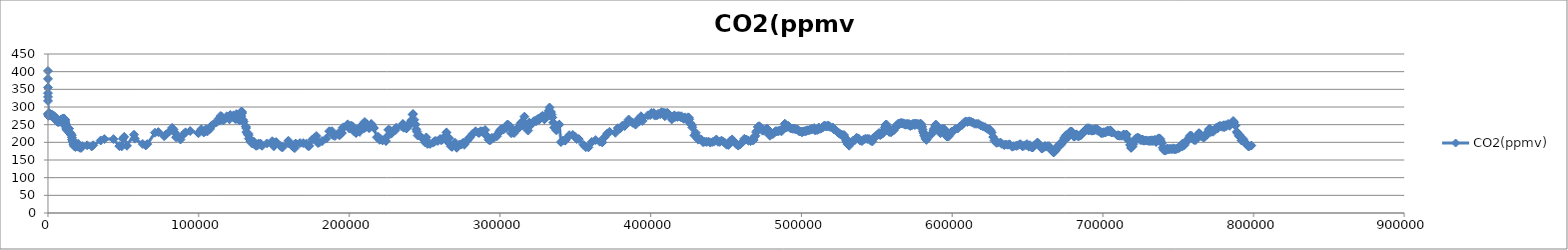
| Category | CO2(ppmv) |
|---|---|
| 0.0 | 401.9 |
| 10.0 | 379.6 |
| 25.0 | 355.1 |
| 35.0 | 339.3 |
| 43.0 | 328.6 |
| 56.0 | 317.3 |
| 137.0 | 280.4 |
| 268.0 | 274.9 |
| 279.0 | 277.9 |
| 395.0 | 279.1 |
| 404.0 | 281.9 |
| 485.0 | 277.7 |
| 559.0 | 281.1 |
| 672.0 | 282.2 |
| 754.0 | 280.1 |
| 877.0 | 278.4 |
| 950.0 | 276.6 |
| 1060.0 | 279.1 |
| 1153.0 | 277.7 |
| 1233.0 | 278.7 |
| 1350.0 | 277.4 |
| 1453.0 | 279.2 |
| 1552.0 | 280 |
| 1638.0 | 278.9 |
| 1733.0 | 278.7 |
| 1812.0 | 278 |
| 1931.0 | 276.9 |
| 2057.0 | 276.7 |
| 2128.0 | 276.7 |
| 2212.0 | 277.6 |
| 2334.0 | 277.9 |
| 2433.0 | 273.9 |
| 2536.0 | 278.9 |
| 2604.0 | 275.3 |
| 2728.0 | 274.7 |
| 2806.0 | 276.3 |
| 2902.0 | 274.6 |
| 3053.0 | 276.3 |
| 3116.0 | 273.1 |
| 3215.0 | 274 |
| 3336.0 | 275 |
| 3453.0 | 273.4 |
| 3523.0 | 273 |
| 3622.0 | 271.5 |
| 3721.0 | 275.4 |
| 3790.0 | 274.9 |
| 3910.0 | 271.7 |
| 4004.0 | 271.6 |
| 4096.0 | 272.8 |
| 4161.0 | 271.5 |
| 4324.0 | 271.1 |
| 4374.0 | 269.1 |
| 4480.0 | 269.8 |
| 4573.0 | 271.5 |
| 4703.0 | 270.7 |
| 4766.0 | 269.3 |
| 4874.0 | 268.6 |
| 5004.0 | 269.8 |
| 5094.0 | 267.6 |
| 5160.0 | 265.3 |
| 5274.0 | 265.2 |
| 5370.0 | 267.6 |
| 5476.0 | 265.9 |
| 5562.0 | 265.5 |
| 5657.0 | 260.7 |
| 5716.0 | 266.7 |
| 5855.0 | 265.5 |
| 5998.0 | 263.2 |
| 6039.0 | 262.7 |
| 6131.0 | 261.2 |
| 6263.0 | 261.1 |
| 6354.0 | 259.4 |
| 6434.0 | 262.1 |
| 6545.0 | 262.9 |
| 6617.0 | 258.1 |
| 6713.0 | 257.6 |
| 6838.0 | 262.3 |
| 6941.0 | 263 |
| 7028.0 | 260.7 |
| 7112.0 | 258.4 |
| 7234.0 | 260.1 |
| 7320.0 | 260.4 |
| 7413.0 | 259.7 |
| 7507.0 | 259.2 |
| 7590.0 | 260.8 |
| 7691.0 | 259.6 |
| 7781.0 | 259.3 |
| 7876.0 | 258.3 |
| 7990.0 | 261.3 |
| 8050.0 | 260.7 |
| 8181.0 | 261.8 |
| 8281.0 | 259 |
| 8387.0 | 260.9 |
| 8477.0 | 260.4 |
| 8579.0 | 259.3 |
| 8653.0 | 262 |
| 8784.0 | 263.7 |
| 8869.0 | 263.8 |
| 8973.0 | 265.2 |
| 9092.0 | 260.6 |
| 9140.0 | 260.9 |
| 9232.0 | 263 |
| 9317.0 | 263.8 |
| 9536.0 | 264.4 |
| 9597.0 | 264.2 |
| 9721.0 | 264 |
| 9807.0 | 263.4 |
| 9909.0 | 265.7 |
| 9983.0 | 264.9 |
| 10088.0 | 267.5 |
| 10209.0 | 266.9 |
| 10294.0 | 266 |
| 10417.0 | 265.1 |
| 10527.0 | 267.6 |
| 10621.0 | 264.8 |
| 10744.0 | 264.8 |
| 10805.0 | 265 |
| 10827.0 | 265.3 |
| 10895.0 | 264.4 |
| 10933.0 | 264.1 |
| 11014.0 | 264.2 |
| 11087.0 | 264.5 |
| 11136.0 | 264 |
| 11201.0 | 263 |
| 11236.0 | 265.2 |
| 11278.0 | 258.8 |
| 11338.0 | 260.8 |
| 11392.0 | 255.4 |
| 11436.0 | 253.9 |
| 11469.0 | 253.8 |
| 11580.0 | 250.7 |
| 11635.0 | 249.7 |
| 11676.0 | 251.1 |
| 11727.0 | 250.7 |
| 11819.0 | 245.3 |
| 11896.0 | 245.3 |
| 11958.0 | 246.6 |
| 12050.0 | 243.2 |
| 12122.0 | 240.3 |
| 12371.0 | 237.5 |
| 12496.0 | 237.6 |
| 12642.0 | 234.2 |
| 12760.0 | 238.3 |
| 12942.0 | 237.3 |
| 13090.0 | 237.9 |
| 13241.0 | 237.6 |
| 13440.0 | 236.4 |
| 13542.0 | 239.2 |
| 13653.0 | 238.6 |
| 13804.0 | 238.6 |
| 13948.0 | 239.1 |
| 14303.0 | 228.5 |
| 14550.0 | 228.4 |
| 14725.0 | 226.1 |
| 14890.0 | 225.2 |
| 15012.0 | 224.5 |
| 15233.0 | 222 |
| 15438.0 | 221 |
| 15570.0 | 220.9 |
| 15742.0 | 219.4 |
| 15886.0 | 214 |
| 16073.0 | 207.5 |
| 16260.0 | 207.7 |
| 16452.0 | 202.9 |
| 16659.0 | 200.8 |
| 16870.0 | 195.2 |
| 17111.0 | 193.9 |
| 17375.0 | 191 |
| 17565.0 | 188.5 |
| 17809.0 | 188.5 |
| 17943.0 | 189.2 |
| 18285.0 | 187 |
| 18541.0 | 188.6 |
| 18828.0 | 189.4 |
| 18868.0 | 192.3 |
| 18921.0 | 188.3 |
| 19347.0 | 188.7 |
| 19509.0 | 188.8 |
| 19748.0 | 190 |
| 19988.0 | 188 |
| 20168.0 | 188.2 |
| 20197.0 | 195 |
| 20502.0 | 187.8 |
| 20748.0 | 186.9 |
| 21011.0 | 186.5 |
| 21257.0 | 184.7 |
| 21507.0 | 186.1 |
| 21854.0 | 185.7 |
| 22015.0 | 184.4 |
| 22827.0 | 189.2 |
| 25994.0 | 191.6 |
| 29063.0 | 188.5 |
| 30020.0 | 191.7 |
| 35009.0 | 205.3 |
| 37471.0 | 209.1 |
| 43500.0 | 209.1 |
| 47336.0 | 189.3 |
| 48854.0 | 188.4 |
| 49690.0 | 210.1 |
| 50663.0 | 215.7 |
| 52382.0 | 190.4 |
| 57088.0 | 221.7 |
| 57657.0 | 210.4 |
| 62859.0 | 195.3 |
| 64939.0 | 191.4 |
| 65939.0 | 194.9 |
| 71049.0 | 227.3 |
| 73227.0 | 229.1 |
| 77150.0 | 217.1 |
| 78183.0 | 221.7 |
| 80614.0 | 230.9 |
| 82417.0 | 241.1 |
| 83333.0 | 236.4 |
| 84016.0 | 228 |
| 85020.0 | 214.2 |
| 86181.0 | 217 |
| 87917.0 | 208 |
| 90357.0 | 224.2 |
| 91249.0 | 228.3 |
| 94353.0 | 232 |
| 99849.0 | 225.8 |
| 100837.0 | 230.8 |
| 101749.0 | 236.9 |
| 103465.0 | 228.1 |
| 104704.0 | 236.9 |
| 105636.0 | 230.6 |
| 107579.0 | 238.2 |
| 108153.0 | 245.6 |
| 109804.0 | 251.2 |
| 111862.0 | 256.7 |
| 113262.0 | 266.3 |
| 114096.0 | 261.4 |
| 114601.0 | 274.5 |
| 115118.0 | 273.2 |
| 116501.0 | 262.5 |
| 117750.0 | 267.6 |
| 118649.0 | 273.7 |
| 119672.0 | 271.9 |
| 120382.0 | 265.2 |
| 121017.0 | 277.6 |
| 122344.0 | 272.1 |
| 123070.0 | 276.4 |
| 124213.0 | 268.7 |
| 124257.0 | 266.6 |
| 124789.0 | 266.3 |
| 125081.0 | 279.7 |
| 125262.0 | 273 |
| 125434.0 | 277.1 |
| 126347.0 | 273.7 |
| 126598.0 | 267.1 |
| 126886.0 | 262.5 |
| 127132.0 | 262.6 |
| 127622.0 | 275.3 |
| 127907.0 | 275.6 |
| 128344.0 | 274 |
| 128372.0 | 287.1 |
| 128609.0 | 286.8 |
| 128866.0 | 282.6 |
| 129146.0 | 264.1 |
| 129340.0 | 263.4 |
| 129652.0 | 257.9 |
| 129736.0 | 259 |
| 131329.0 | 245 |
| 131455.0 | 240.4 |
| 131728.0 | 228.9 |
| 132492.0 | 223.5 |
| 133069.0 | 223.9 |
| 133105.0 | 220.3 |
| 133427.0 | 210.6 |
| 134123.0 | 208.9 |
| 134287.0 | 203.7 |
| 134960.0 | 204.5 |
| 135114.0 | 200.4 |
| 135207.0 | 198 |
| 135603.0 | 198 |
| 135883.0 | 201.7 |
| 136011.0 | 200.7 |
| 136251.0 | 202.4 |
| 136567.0 | 195.8 |
| 136655.0 | 201.1 |
| 137293.0 | 194.3 |
| 137633.0 | 193.4 |
| 137982.0 | 194.2 |
| 138185.0 | 190.2 |
| 139275.0 | 192.3 |
| 139617.0 | 196.5 |
| 140899.0 | 195.6 |
| 140960.0 | 196.4 |
| 142058.0 | 190.4 |
| 145363.0 | 196.9 |
| 148831.0 | 203 |
| 149803.0 | 191.9 |
| 149921.0 | 188.9 |
| 151423.0 | 200.6 |
| 154480.0 | 189 |
| 155395.0 | 185.5 |
| 155813.0 | 187.5 |
| 159562.0 | 204.3 |
| 159943.0 | 196.5 |
| 161679.0 | 191.6 |
| 162228.0 | 190.1 |
| 163024.0 | 186.7 |
| 163698.0 | 183.8 |
| 164439.0 | 196.6 |
| 167183.0 | 197.8 |
| 169492.0 | 197.7 |
| 171351.0 | 196 |
| 172434.0 | 190.3 |
| 173135.0 | 189.4 |
| 173394.0 | 190.1 |
| 175306.0 | 207.7 |
| 177139.0 | 213.2 |
| 178179.0 | 217.7 |
| 179117.0 | 198.1 |
| 180068.0 | 199.7 |
| 182046.0 | 203.4 |
| 184685.0 | 210.7 |
| 186697.0 | 231.3 |
| 188436.0 | 231.4 |
| 189076.0 | 220.3 |
| 190352.0 | 218 |
| 192910.0 | 226.5 |
| 193481.0 | 220 |
| 195017.0 | 226.4 |
| 195673.0 | 241.2 |
| 196179.0 | 242.6 |
| 198972.0 | 250.9 |
| 199918.0 | 239.1 |
| 201163.0 | 247.6 |
| 202413.0 | 244.4 |
| 202874.0 | 231.9 |
| 203317.0 | 232.2 |
| 203837.0 | 228.6 |
| 204480.0 | 226.3 |
| 204908.0 | 229.4 |
| 205362.0 | 231.4 |
| 205952.0 | 238.1 |
| 206144.0 | 237.2 |
| 206810.0 | 230 |
| 207120.0 | 240.5 |
| 207544.0 | 242.2 |
| 208064.0 | 244.6 |
| 208254.0 | 243.9 |
| 208803.0 | 247.2 |
| 208995.0 | 252 |
| 209432.0 | 246.9 |
| 209817.0 | 239.5 |
| 210154.0 | 257.4 |
| 210813.0 | 243.4 |
| 211858.0 | 251.2 |
| 212716.0 | 241.4 |
| 213270.0 | 240.3 |
| 213536.0 | 242.6 |
| 213984.0 | 247.5 |
| 214459.0 | 251.7 |
| 214794.0 | 251.1 |
| 215382.0 | 245.3 |
| 216352.0 | 240.5 |
| 218361.0 | 214.1 |
| 219116.0 | 216.1 |
| 220058.0 | 207.1 |
| 220739.0 | 208.8 |
| 222030.0 | 205.6 |
| 224269.0 | 203.3 |
| 224923.0 | 215.7 |
| 225909.0 | 235.5 |
| 226711.0 | 234.5 |
| 227027.0 | 233.1 |
| 227776.0 | 224.5 |
| 229423.0 | 232.4 |
| 230422.0 | 233.9 |
| 231066.0 | 241.6 |
| 234817.0 | 245.2 |
| 235480.0 | 252.1 |
| 236114.0 | 241.4 |
| 236734.0 | 247.4 |
| 237294.0 | 243.1 |
| 237868.0 | 239.1 |
| 238558.0 | 245.6 |
| 239013.0 | 245.8 |
| 239477.0 | 247.4 |
| 239973.0 | 252.8 |
| 240945.0 | 259.7 |
| 241366.0 | 263.2 |
| 242007.0 | 279 |
| 242346.0 | 280.2 |
| 243071.0 | 263.7 |
| 243429.0 | 252.3 |
| 243856.0 | 249.9 |
| 244347.0 | 236.7 |
| 244864.0 | 230.4 |
| 245441.0 | 219.4 |
| 247681.0 | 214.7 |
| 250133.0 | 200.2 |
| 251005.0 | 213.9 |
| 251864.0 | 195.4 |
| 252739.0 | 196.7 |
| 253636.0 | 195.4 |
| 255498.0 | 199 |
| 256309.0 | 201.9 |
| 257100.0 | 204 |
| 258661.0 | 203.9 |
| 260353.0 | 209.6 |
| 260916.0 | 205.7 |
| 262092.0 | 208.9 |
| 262930.0 | 214.6 |
| 264509.0 | 228.1 |
| 265653.0 | 199.9 |
| 266326.0 | 211.7 |
| 267442.0 | 188.7 |
| 268181.0 | 187.2 |
| 269154.0 | 194.2 |
| 270222.0 | 198.8 |
| 271256.0 | 184.7 |
| 272311.0 | 190.4 |
| 273310.0 | 193.9 |
| 274321.0 | 194.1 |
| 275350.0 | 198.4 |
| 276326.0 | 193.2 |
| 277361.0 | 202.2 |
| 278350.0 | 204.5 |
| 279320.0 | 211 |
| 280269.0 | 215.3 |
| 281758.0 | 223.7 |
| 283785.0 | 231.3 |
| 285380.0 | 228 |
| 286128.0 | 226.4 |
| 287036.0 | 231.4 |
| 287538.0 | 230.4 |
| 288233.0 | 231 |
| 290153.0 | 234.9 |
| 290730.0 | 220.4 |
| 291367.0 | 217.1 |
| 292405.0 | 207.6 |
| 293057.0 | 206 |
| 293779.0 | 206.7 |
| 294568.0 | 212.7 |
| 295930.0 | 213.1 |
| 297921.0 | 217.1 |
| 298741.0 | 224.4 |
| 299621.0 | 231 |
| 300472.0 | 236.1 |
| 301402.0 | 239 |
| 302280.0 | 236 |
| 303226.0 | 240.2 |
| 304232.0 | 240.7 |
| 304901.0 | 250.2 |
| 305655.0 | 248.6 |
| 306547.0 | 244.8 |
| 307495.0 | 225.8 |
| 308744.0 | 227.8 |
| 309389.0 | 226.2 |
| 310168.0 | 233.2 |
| 311013.0 | 237.8 |
| 311868.0 | 239 |
| 312676.0 | 241.9 |
| 313414.0 | 251.6 |
| 314144.0 | 256.7 |
| 314867.0 | 257.1 |
| 315572.0 | 246.8 |
| 316200.0 | 272.6 |
| 316897.0 | 251.6 |
| 317734.0 | 245.2 |
| 318559.0 | 233.4 |
| 319480.0 | 255.8 |
| 320358.0 | 249.2 |
| 322015.0 | 257.2 |
| 322767.0 | 260.4 |
| 323526.0 | 260.3 |
| 324280.0 | 260.5 |
| 324971.0 | 266.2 |
| 325720.0 | 264 |
| 326321.0 | 266.1 |
| 326972.0 | 270.1 |
| 327590.0 | 271.9 |
| 328221.0 | 275.1 |
| 329475.0 | 265 |
| 330208.0 | 271.7 |
| 330740.0 | 272.6 |
| 331438.0 | 273.1 |
| 331944.0 | 282.4 |
| 332285.0 | 289.1 |
| 332462.0 | 288.4 |
| 332919.0 | 298.6 |
| 333380.0 | 278.1 |
| 333890.0 | 285.8 |
| 334261.0 | 278.6 |
| 334748.0 | 270.5 |
| 335287.0 | 255.7 |
| 335918.0 | 241.9 |
| 336725.0 | 239.6 |
| 337391.0 | 234.2 |
| 339298.0 | 250.1 |
| 340456.0 | 200.7 |
| 341802.0 | 205.2 |
| 343282.0 | 204.8 |
| 344446.0 | 211.9 |
| 345980.0 | 220.3 |
| 348298.0 | 221.1 |
| 349688.0 | 216.2 |
| 350925.0 | 209.4 |
| 352275.0 | 209.2 |
| 355302.0 | 193 |
| 356898.0 | 186.1 |
| 358712.0 | 185.8 |
| 360957.0 | 201.2 |
| 363385.0 | 206.3 |
| 366235.0 | 201.9 |
| 367856.0 | 199.9 |
| 369446.0 | 214.7 |
| 371090.0 | 224.6 |
| 372646.0 | 229.6 |
| 376568.0 | 227 |
| 378096.0 | 240 |
| 379696.0 | 239.1 |
| 381132.0 | 246.8 |
| 382670.0 | 245.8 |
| 384534.0 | 258.1 |
| 385398.0 | 264.6 |
| 386144.0 | 259.2 |
| 388062.0 | 255.2 |
| 389946.0 | 250.1 |
| 391896.0 | 266.3 |
| 392544.0 | 259.5 |
| 393579.0 | 273.6 |
| 394560.0 | 260.7 |
| 398086.0 | 276.3 |
| 399722.0 | 277.1 |
| 400504.0 | 283.2 |
| 402000.0 | 283.1 |
| 402731.0 | 275.7 |
| 404181.0 | 276.5 |
| 404927.0 | 280.5 |
| 406368.0 | 279.6 |
| 407093.0 | 285.6 |
| 408600.0 | 284.5 |
| 409383.0 | 275.2 |
| 409383.0 | 274.2 |
| 410206.0 | 282.6 |
| 411071.0 | 283.5 |
| 412962.0 | 274.9 |
| 413948.0 | 264.9 |
| 414963.0 | 271.6 |
| 415717.0 | 276.4 |
| 416193.0 | 271.7 |
| 417191.0 | 273.4 |
| 417698.0 | 271.8 |
| 418245.0 | 274.6 |
| 419260.0 | 273.7 |
| 419808.0 | 271.2 |
| 420350.0 | 273.8 |
| 421484.0 | 268.6 |
| 422074.0 | 266.4 |
| 422649.0 | 270.6 |
| 423764.0 | 267.7 |
| 424332.0 | 268.3 |
| 424840.0 | 270.8 |
| 425242.0 | 270 |
| 425569.0 | 265.4 |
| 425975.0 | 255.3 |
| 426598.0 | 252.1 |
| 427285.0 | 248.2 |
| 427566.0 | 242.5 |
| 429006.0 | 219.7 |
| 429876.0 | 227.2 |
| 431063.0 | 211.5 |
| 431445.0 | 207.6 |
| 432599.0 | 209.8 |
| 433674.0 | 207.5 |
| 434804.0 | 200.3 |
| 435989.0 | 201.7 |
| 437152.0 | 201.3 |
| 438356.0 | 202 |
| 439565.0 | 199.1 |
| 441220.0 | 201.1 |
| 442411.0 | 203.5 |
| 443562.0 | 208.1 |
| 444650.0 | 201.7 |
| 445829.0 | 201.2 |
| 446984.0 | 204.9 |
| 448103.0 | 201.9 |
| 449244.0 | 198.4 |
| 450455.0 | 193.3 |
| 451593.0 | 192.5 |
| 452283.0 | 199.1 |
| 452795.0 | 204.3 |
| 453514.0 | 203.3 |
| 454023.0 | 208.3 |
| 455279.0 | 202.4 |
| 456591.0 | 195.5 |
| 458049.0 | 190.7 |
| 459430.0 | 194.4 |
| 460792.0 | 199.9 |
| 461687.0 | 205.2 |
| 462133.0 | 210 |
| 463456.0 | 208.1 |
| 464866.0 | 204.4 |
| 466265.0 | 203.4 |
| 467602.0 | 205.5 |
| 468323.0 | 206.5 |
| 468810.0 | 215.5 |
| 469470.0 | 218.7 |
| 469941.0 | 229.2 |
| 470597.0 | 232.7 |
| 471046.0 | 243.7 |
| 471763.0 | 243.9 |
| 472095.0 | 245.6 |
| 473102.0 | 241.2 |
| 474162.0 | 233.1 |
| 475218.0 | 232.8 |
| 476240.0 | 236.6 |
| 477162.0 | 239.1 |
| 477719.0 | 236.5 |
| 478124.0 | 231.3 |
| 478721.0 | 220.8 |
| 479144.0 | 218.8 |
| 480108.0 | 223.8 |
| 481035.0 | 223.4 |
| 481932.0 | 227.3 |
| 482803.0 | 231.4 |
| 483649.0 | 231.4 |
| 484465.0 | 231.2 |
| 485276.0 | 233 |
| 486043.0 | 232.9 |
| 486816.0 | 231.3 |
| 487541.0 | 237.1 |
| 488268.0 | 242 |
| 488689.0 | 240.9 |
| 488996.0 | 252.8 |
| 489475.0 | 249.3 |
| 489722.0 | 242.6 |
| 490445.0 | 243.3 |
| 491191.0 | 246.7 |
| 491959.0 | 243.7 |
| 492738.0 | 239.7 |
| 493507.0 | 239.1 |
| 494311.0 | 238.3 |
| 495085.0 | 238.5 |
| 495853.0 | 237.6 |
| 496608.0 | 236.4 |
| 497366.0 | 236.5 |
| 498104.0 | 232.8 |
| 498865.0 | 230.6 |
| 499610.0 | 230.8 |
| 500363.0 | 228.2 |
| 501130.0 | 230.8 |
| 501866.0 | 231.2 |
| 502625.0 | 232 |
| 503375.0 | 232.2 |
| 504083.0 | 234.1 |
| 504777.0 | 233.9 |
| 505516.0 | 235.5 |
| 506287.0 | 236 |
| 507011.0 | 238.2 |
| 507714.0 | 237 |
| 508476.0 | 240.3 |
| 509247.0 | 233.4 |
| 510008.0 | 236.4 |
| 510765.0 | 235.2 |
| 511515.0 | 242 |
| 512269.0 | 238.2 |
| 512997.0 | 239.2 |
| 513724.0 | 241.5 |
| 514429.0 | 243 |
| 515113.0 | 247.2 |
| 515771.0 | 246.2 |
| 516417.0 | 245.5 |
| 517069.0 | 245.3 |
| 517706.0 | 247.7 |
| 518334.0 | 245.5 |
| 518965.0 | 243.5 |
| 520892.0 | 241.9 |
| 521552.0 | 236.8 |
| 522216.0 | 235.8 |
| 522923.0 | 233.7 |
| 523666.0 | 230.3 |
| 524409.0 | 227.8 |
| 525164.0 | 224.7 |
| 525908.0 | 222.7 |
| 526661.0 | 221.2 |
| 527454.0 | 220.3 |
| 528262.0 | 220.7 |
| 528747.0 | 214.5 |
| 529101.0 | 211.4 |
| 529640.0 | 204.4 |
| 530016.0 | 200 |
| 530685.0 | 195.1 |
| 531035.0 | 193.8 |
| 531662.0 | 190.5 |
| 532119.0 | 199.8 |
| 533246.0 | 199.4 |
| 534364.0 | 205 |
| 535483.0 | 206.4 |
| 536622.0 | 212.9 |
| 537770.0 | 211.2 |
| 538959.0 | 205 |
| 540154.0 | 203.6 |
| 541345.0 | 208.1 |
| 542502.0 | 210.3 |
| 543676.0 | 209.6 |
| 544804.0 | 209.7 |
| 545956.0 | 204.6 |
| 547013.0 | 202.5 |
| 547573.0 | 208.8 |
| 547972.0 | 213.6 |
| 548933.0 | 215.2 |
| 549830.0 | 219.9 |
| 550637.0 | 221.7 |
| 551124.0 | 222.3 |
| 551452.0 | 226.3 |
| 551979.0 | 222.1 |
| 552250.0 | 220.3 |
| 552961.0 | 223.6 |
| 553626.0 | 224.3 |
| 554254.0 | 226.7 |
| 554831.0 | 233.9 |
| 555345.0 | 241 |
| 555637.0 | 243 |
| 555839.0 | 249.1 |
| 556143.0 | 244 |
| 556364.0 | 250.5 |
| 556724.0 | 245.6 |
| 556889.0 | 240.4 |
| 557385.0 | 238.1 |
| 557887.0 | 234.5 |
| 558183.0 | 229.7 |
| 558393.0 | 230.2 |
| 558929.0 | 230.3 |
| 559461.0 | 228.3 |
| 559972.0 | 231.6 |
| 560459.0 | 231.9 |
| 560930.0 | 234.6 |
| 561309.0 | 234.1 |
| 561846.0 | 240.1 |
| 562272.0 | 242.3 |
| 562690.0 | 245.7 |
| 563115.0 | 245.8 |
| 563517.0 | 247.6 |
| 563918.0 | 251.4 |
| 564311.0 | 252.4 |
| 564699.0 | 252.6 |
| 565077.0 | 251.4 |
| 565466.0 | 253.7 |
| 565851.0 | 254.3 |
| 566233.0 | 253.9 |
| 566619.0 | 254.5 |
| 567007.0 | 253.2 |
| 567381.0 | 253.9 |
| 567777.0 | 252.8 |
| 568167.0 | 253 |
| 568556.0 | 250.2 |
| 568946.0 | 251.3 |
| 569331.0 | 250 |
| 569728.0 | 251.3 |
| 570139.0 | 251.8 |
| 570548.0 | 251.8 |
| 570955.0 | 249.6 |
| 571367.0 | 251.6 |
| 571775.0 | 250.3 |
| 572190.0 | 246.3 |
| 572619.0 | 247.7 |
| 573037.0 | 249.2 |
| 573462.0 | 248.7 |
| 573902.0 | 251.8 |
| 574353.0 | 251.9 |
| 574803.0 | 252.1 |
| 575265.0 | 248.9 |
| 575730.0 | 252.5 |
| 576222.0 | 252.9 |
| 576723.0 | 251.3 |
| 577242.0 | 251.3 |
| 577769.0 | 251.1 |
| 578305.0 | 249.1 |
| 578857.0 | 252.9 |
| 579435.0 | 251.5 |
| 579821.0 | 244.1 |
| 580019.0 | 243.8 |
| 580400.0 | 236.2 |
| 580695.0 | 230.3 |
| 581160.0 | 225.2 |
| 581507.0 | 219.4 |
| 582000.0 | 215.4 |
| 582391.0 | 209.9 |
| 583034.0 | 206.7 |
| 583413.0 | 210.6 |
| 586406.0 | 224 |
| 586893.0 | 226 |
| 587647.0 | 234.4 |
| 588034.0 | 238.8 |
| 588716.0 | 246.3 |
| 589224.0 | 250.2 |
| 589868.0 | 248.1 |
| 590335.0 | 243.6 |
| 590893.0 | 237.4 |
| 592279.0 | 225.7 |
| 592697.0 | 229.4 |
| 593415.0 | 233.2 |
| 593870.0 | 238.1 |
| 594639.0 | 238 |
| 595189.0 | 232.9 |
| 595950.0 | 221.2 |
| 596515.0 | 216.4 |
| 597443.0 | 216.3 |
| 597966.0 | 219 |
| 598833.0 | 226 |
| 599434.0 | 229.4 |
| 600882.0 | 232.5 |
| 602278.0 | 237.9 |
| 603673.0 | 239.1 |
| 605076.0 | 244.5 |
| 606374.0 | 248.5 |
| 607708.0 | 254.6 |
| 608929.0 | 259.2 |
| 610136.0 | 257.7 |
| 611319.0 | 259.6 |
| 612514.0 | 258 |
| 613709.0 | 256 |
| 614923.0 | 252.5 |
| 616227.0 | 252.4 |
| 617544.0 | 252.3 |
| 618955.0 | 247.9 |
| 620338.0 | 245.4 |
| 621760.0 | 243 |
| 623214.0 | 238.6 |
| 624690.0 | 237.3 |
| 625570.0 | 234.3 |
| 626215.0 | 227.8 |
| 627211.0 | 214.9 |
| 627999.0 | 205 |
| 629446.0 | 198.7 |
| 630295.0 | 199.9 |
| 632001.0 | 199.5 |
| 632856.0 | 195.6 |
| 634592.0 | 192.1 |
| 635489.0 | 193.9 |
| 636957.0 | 193 |
| 638127.0 | 194.3 |
| 639848.0 | 187.7 |
| 640760.0 | 189.1 |
| 642405.0 | 190.2 |
| 643204.0 | 190.4 |
| 644662.0 | 194.1 |
| 645470.0 | 194.6 |
| 646723.0 | 188.6 |
| 647588.0 | 190.5 |
| 648946.0 | 192.1 |
| 649598.0 | 194.8 |
| 650891.0 | 187.8 |
| 651556.0 | 192 |
| 652802.0 | 185.8 |
| 653448.0 | 185.3 |
| 654473.0 | 191.3 |
| 655202.0 | 193.2 |
| 656286.0 | 198.4 |
| 656882.0 | 198.7 |
| 657923.0 | 191.3 |
| 658474.0 | 189.2 |
| 659524.0 | 182.4 |
| 660084.0 | 183.9 |
| 660981.0 | 186.6 |
| 661650.0 | 189.8 |
| 662669.0 | 187.8 |
| 663206.0 | 189 |
| 664192.0 | 189.1 |
| 664690.0 | 185.8 |
| 665645.0 | 178.2 |
| 666174.0 | 178.5 |
| 666995.0 | 172.7 |
| 667569.0 | 171.6 |
| 668447.0 | 175.6 |
| 668934.0 | 178.5 |
| 669751.0 | 185.5 |
| 670176.0 | 189.3 |
| 670916.0 | 192.6 |
| 671286.0 | 194.6 |
| 671926.0 | 192.5 |
| 672386.0 | 194.8 |
| 673095.0 | 198.7 |
| 673475.0 | 202.3 |
| 674173.0 | 209.2 |
| 674521.0 | 213.7 |
| 675589.0 | 220 |
| 676170.0 | 217.4 |
| 676524.0 | 214 |
| 677068.0 | 215.6 |
| 677380.0 | 217.4 |
| 677984.0 | 226.5 |
| 678291.0 | 230 |
| 678914.0 | 230.8 |
| 679252.0 | 230.3 |
| 679732.0 | 223 |
| 680081.0 | 225 |
| 680608.0 | 218.4 |
| 680920.0 | 216.2 |
| 681531.0 | 217.3 |
| 681849.0 | 219.7 |
| 682446.0 | 222.6 |
| 682762.0 | 221.3 |
| 683262.0 | 218.7 |
| 683612.0 | 217.5 |
| 684142.0 | 217.5 |
| 684419.0 | 219.4 |
| 684949.0 | 219.5 |
| 685217.0 | 219.7 |
| 685716.0 | 223.5 |
| 685980.0 | 224.4 |
| 686425.0 | 224.3 |
| 686726.0 | 227.3 |
| 687227.0 | 228.7 |
| 687470.0 | 228.8 |
| 687949.0 | 232.3 |
| 688195.0 | 233 |
| 688652.0 | 235.8 |
| 688881.0 | 234.9 |
| 689304.0 | 235.8 |
| 689603.0 | 239.9 |
| 690057.0 | 235.6 |
| 690294.0 | 234.8 |
| 690771.0 | 240 |
| 690999.0 | 234 |
| 691432.0 | 235.6 |
| 691672.0 | 236.6 |
| 692057.0 | 235.5 |
| 692338.0 | 235.9 |
| 692765.0 | 232.9 |
| 692990.0 | 234.8 |
| 693433.0 | 234.1 |
| 693639.0 | 234.1 |
| 694068.0 | 235.4 |
| 694300.0 | 234.4 |
| 694672.0 | 235.8 |
| 694941.0 | 236.9 |
| 695383.0 | 236.7 |
| 695618.0 | 237.6 |
| 696062.0 | 234.6 |
| 696287.0 | 234.8 |
| 696717.0 | 235.4 |
| 696963.0 | 232.9 |
| 697331.0 | 232.4 |
| 697660.0 | 232.2 |
| 698120.0 | 231 |
| 698386.0 | 228 |
| 698880.0 | 226.4 |
| 699102.0 | 227.7 |
| 699633.0 | 227.6 |
| 699909.0 | 226 |
| 700389.0 | 228.7 |
| 700744.0 | 227.6 |
| 701242.0 | 228.2 |
| 701606.0 | 228.8 |
| 702158.0 | 229.3 |
| 702381.0 | 230.3 |
| 702988.0 | 232.4 |
| 703384.0 | 232.8 |
| 703934.0 | 231.2 |
| 704211.0 | 231.2 |
| 704973.0 | 233.9 |
| 705410.0 | 228.5 |
| 706141.0 | 228.6 |
| 706409.0 | 228.1 |
| 709680.0 | 219.7 |
| 710237.0 | 220.2 |
| 711104.0 | 218.9 |
| 711421.0 | 218.7 |
| 712833.0 | 218.5 |
| 713843.0 | 222.3 |
| 714288.0 | 221.7 |
| 715180.0 | 217.7 |
| 715750.0 | 222.1 |
| 716704.0 | 208.1 |
| 717065.0 | 205 |
| 718064.0 | 192.9 |
| 718779.0 | 184.3 |
| 719794.0 | 187.8 |
| 720337.0 | 195.2 |
| 721318.0 | 206.3 |
| 722039.0 | 211.3 |
| 723133.0 | 213.4 |
| 723464.0 | 213.2 |
| 724445.0 | 210.3 |
| 725059.0 | 206.3 |
| 725937.0 | 206.6 |
| 726322.0 | 208.1 |
| 727192.0 | 204.5 |
| 727732.0 | 205.5 |
| 728568.0 | 205.1 |
| 728921.0 | 205.4 |
| 730299.0 | 204 |
| 730949.0 | 204.1 |
| 731329.0 | 204.9 |
| 732141.0 | 203.8 |
| 732548.0 | 205.9 |
| 733261.0 | 203.9 |
| 733543.0 | 204.4 |
| 734223.0 | 205.3 |
| 734604.0 | 207.4 |
| 735167.0 | 201.7 |
| 735459.0 | 201.3 |
| 736079.0 | 204.1 |
| 736460.0 | 209.7 |
| 737034.0 | 208.1 |
| 737266.0 | 211.3 |
| 737889.0 | 210.6 |
| 738272.0 | 206.5 |
| 738844.0 | 200.3 |
| 739137.0 | 197.8 |
| 739842.0 | 185 |
| 740277.0 | 178.9 |
| 741021.0 | 178.6 |
| 741307.0 | 176.6 |
| 742075.0 | 177.9 |
| 742558.0 | 182.3 |
| 743233.0 | 181.7 |
| 743589.0 | 180.4 |
| 744354.0 | 181.2 |
| 744843.0 | 182 |
| 745836.0 | 180.2 |
| 746643.0 | 183.1 |
| 747110.0 | 180.8 |
| 747759.0 | 180.8 |
| 748101.0 | 180.4 |
| 748913.0 | 181.4 |
| 749401.0 | 182.9 |
| 750194.0 | 184.8 |
| 750476.0 | 184 |
| 751301.0 | 186.2 |
| 751830.0 | 190.1 |
| 752605.0 | 188 |
| 752978.0 | 196.5 |
| 753984.0 | 191.5 |
| 754394.0 | 195.8 |
| 755241.0 | 200.5 |
| 755495.0 | 201.9 |
| 756357.0 | 206 |
| 756871.0 | 210.7 |
| 757561.0 | 215 |
| 757962.0 | 219.2 |
| 758259.0 | 215.3 |
| 758475.0 | 217.6 |
| 758883.0 | 217.9 |
| 759306.0 | 214.9 |
| 760202.0 | 208.8 |
| 760500.0 | 206.9 |
| 761453.0 | 206.1 |
| 762064.0 | 212 |
| 762871.0 | 216 |
| 763319.0 | 215 |
| 763686.0 | 225.7 |
| 763934.0 | 221.4 |
| 764249.0 | 224.1 |
| 764833.0 | 222.6 |
| 765735.0 | 216.8 |
| 766110.0 | 215.7 |
| 767096.0 | 213.5 |
| 767737.0 | 217.7 |
| 768655.0 | 222.4 |
| 769050.0 | 221.4 |
| 769514.0 | 228.1 |
| 769787.0 | 226 |
| 770133.0 | 231.5 |
| 770447.0 | 235.6 |
| 770724.0 | 238.2 |
| 770994.0 | 235.6 |
| 771260.0 | 237.7 |
| 771708.0 | 229.5 |
| 772076.0 | 230.9 |
| 773043.0 | 230 |
| 773680.0 | 233.3 |
| 774548.0 | 236.9 |
| 775051.0 | 240.5 |
| 776037.0 | 238.8 |
| 776636.0 | 243.9 |
| 777556.0 | 246.3 |
| 777900.0 | 246.1 |
| 778798.0 | 245.8 |
| 779364.0 | 243.9 |
| 780268.0 | 248.5 |
| 780612.0 | 242.8 |
| 781535.0 | 248.7 |
| 782059.0 | 246.2 |
| 783263.0 | 252.1 |
| 784147.0 | 246.9 |
| 784692.0 | 250.7 |
| 785413.0 | 253.3 |
| 785789.0 | 255.4 |
| 786587.0 | 260.3 |
| 787076.0 | 256.9 |
| 787805.0 | 248.1 |
| 788033.0 | 247.9 |
| 788887.0 | 229.5 |
| 789381.0 | 226.3 |
| 790153.0 | 218.2 |
| 790538.0 | 221.3 |
| 791491.0 | 215.4 |
| 792081.0 | 205.1 |
| 792943.0 | 204 |
| 793260.0 | 209 |
| 794608.0 | 199.4 |
| 795202.0 | 195.2 |
| 796467.0 | 189.3 |
| 797099.0 | 188.4 |
| 798512.0 | 191 |